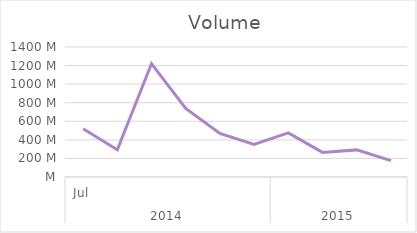
| Category | Total |
|---|---|
| 0 | 518701600 |
| 1 | 293222000 |
| 2 | 1220435700 |
| 3 | 738416400 |
| 4 | 470123300 |
| 5 | 349931000 |
| 6 | 475058700 |
| 7 | 265059900 |
| 8 | 291951300 |
| 9 | 176735300 |